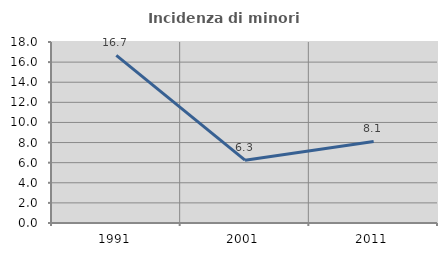
| Category | Incidenza di minori stranieri |
|---|---|
| 1991.0 | 16.667 |
| 2001.0 | 6.25 |
| 2011.0 | 8.108 |